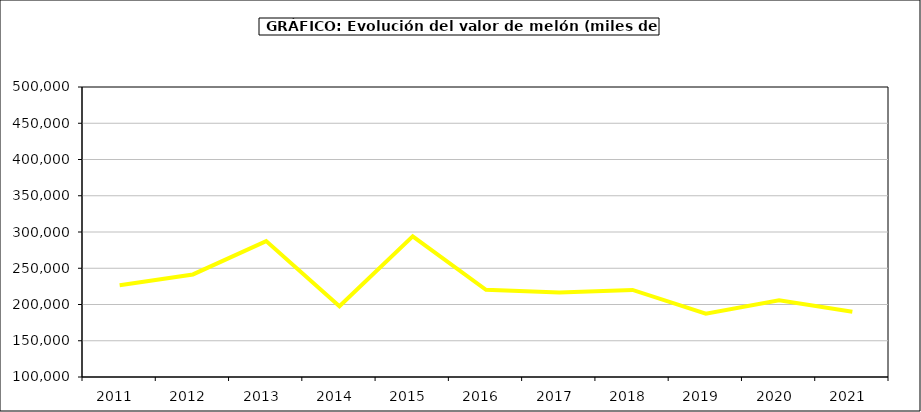
| Category | Valor |
|---|---|
| 2011.0 | 226631.76 |
| 2012.0 | 241464.672 |
| 2013.0 | 287421.365 |
| 2014.0 | 197555.814 |
| 2015.0 | 293985.4 |
| 2016.0 | 220336 |
| 2017.0 | 216504.545 |
| 2018.0 | 220100.149 |
| 2019.0 | 187296.187 |
| 2020.0 | 205838.488 |
| 2021.0 | 190103.254 |